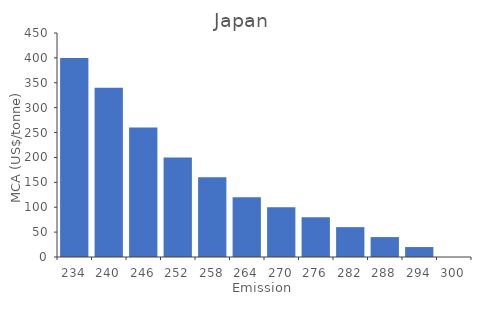
| Category | TCA (million $) |
|---|---|
| 234.0 | 400 |
| 240.0 | 340 |
| 246.0 | 260 |
| 252.0 | 200 |
| 258.0 | 160 |
| 264.0 | 120 |
| 270.0 | 100 |
| 276.0 | 80 |
| 282.0 | 60 |
| 288.0 | 40 |
| 294.0 | 20 |
| 300.0 | 0 |